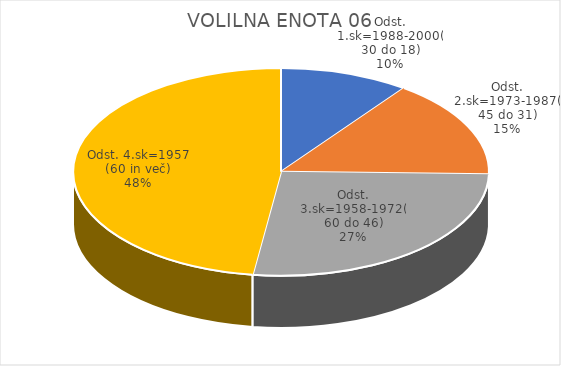
| Category | VOLILNA ENOTA 06 |
|---|---|
| Odst. 1.sk=1988-2000(30 do 18) | 2.78 |
| Odst. 2.sk=1973-1987(45 do 31) | 4.23 |
| Odst. 3.sk=1958-1972(60 do 46) | 7.4 |
| Odst. 4.sk=1957 (60 in več) | 13.21 |